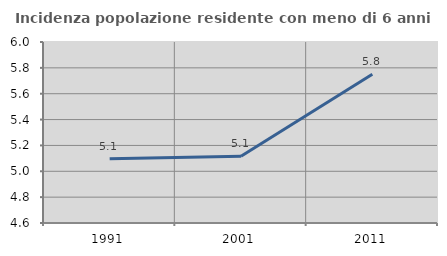
| Category | Incidenza popolazione residente con meno di 6 anni |
|---|---|
| 1991.0 | 5.097 |
| 2001.0 | 5.116 |
| 2011.0 | 5.751 |